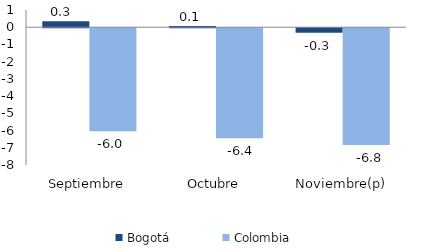
| Category | Bogotá | Colombia |
|---|---|---|
| Septiembre | 0.346 | -5.984 |
| Octubre | 0.065 | -6.382 |
| Noviembre(p) | -0.266 | -6.779 |